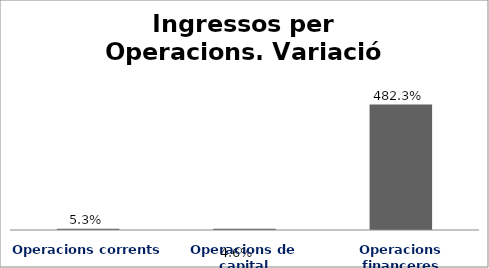
| Category | Series 0 |
|---|---|
| Operacions corrents | 0.053 |
| Operacions de capital | 0.046 |
| Operacions financeres | 4.823 |